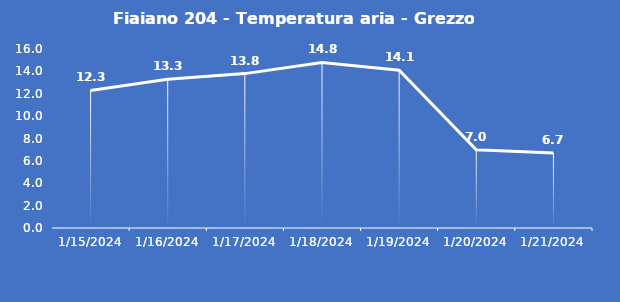
| Category | Fiaiano 204 - Temperatura aria - Grezzo (°C) |
|---|---|
| 1/15/24 | 12.3 |
| 1/16/24 | 13.3 |
| 1/17/24 | 13.8 |
| 1/18/24 | 14.8 |
| 1/19/24 | 14.1 |
| 1/20/24 | 7 |
| 1/21/24 | 6.7 |